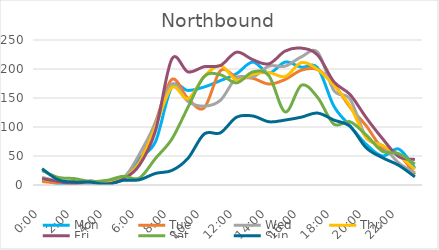
| Category | Mon | Tue | Wed | Thu | Fri | Sat | Sun |
|---|---|---|---|---|---|---|---|
| 0.0 | 10 | 6 | 13 | 10 | 11 | 25 | 28 |
| 0.041667 | 2 | 4 | 7 | 6 | 6 | 13 | 9 |
| 0.083333 | 1 | 6 | 3 | 3 | 2 | 11 | 5 |
| 0.125 | 5 | 3 | 1 | 6 | 7 | 6 | 5 |
| 0.166667 | 7 | 5 | 4 | 3 | 2 | 8 | 1 |
| 0.208333 | 12 | 11 | 10 | 11 | 10 | 15 | 8 |
| 0.25 | 46 | 39 | 53 | 38 | 34 | 12 | 9 |
| 0.291667 | 75 | 109 | 107 | 101 | 94 | 46 | 20 |
| 0.333333 | 169 | 182 | 174 | 168 | 217 | 79 | 25 |
| 0.375 | 163 | 149 | 144 | 149 | 195 | 134 | 46 |
| 0.416667 | 169 | 133 | 136 | 187 | 204 | 187 | 88 |
| 0.458333 | 180 | 197 | 146 | 206 | 206 | 190 | 90 |
| 0.5 | 192 | 186 | 185 | 181 | 229 | 176 | 117 |
| 0.541667 | 212 | 184 | 186 | 191 | 216 | 195 | 119 |
| 0.5833333333333334 | 193 | 174 | 205 | 194 | 209 | 188 | 109 |
| 0.625 | 212 | 182 | 205 | 187 | 231 | 126 | 112 |
| 0.666667 | 203 | 198 | 221 | 211 | 236 | 172 | 117 |
| 0.708333 | 202 | 199 | 229 | 199 | 224 | 151 | 124 |
| 0.75 | 136 | 174 | 163 | 172 | 178 | 105 | 112 |
| 0.791667 | 102 | 134 | 148 | 136 | 156 | 109 | 101 |
| 0.833333 | 70 | 102 | 82 | 81 | 116 | 86 | 64 |
| 0.875 | 50 | 63 | 68 | 68 | 80 | 58 | 47 |
| 0.916667 | 62 | 53 | 38 | 51 | 49 | 54 | 34 |
| 0.958333 | 29 | 18 | 21 | 27 | 44 | 36 | 14 |